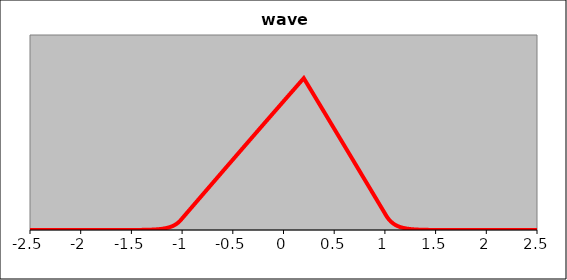
| Category | Series 2 |
|---|---|
| -2.50000000000002 | 0 |
| -2.48000000000002 | 0 |
| -2.46000000000002 | 0 |
| -2.44000000000002 | 0 |
| -2.42000000000002 | 0 |
| -2.40000000000002 | 0 |
| -2.38000000000002 | 0 |
| -2.36000000000002 | 0 |
| -2.34000000000002 | 0 |
| -2.32000000000002 | 0 |
| -2.30000000000002 | 0 |
| -2.28000000000002 | 0 |
| -2.2600000000000198 | 0 |
| -2.2400000000000198 | 0 |
| -2.2200000000000197 | 0 |
| -2.2000000000000197 | 0 |
| -2.1800000000000197 | 0 |
| -2.1600000000000197 | 0 |
| -2.1400000000000197 | 0 |
| -2.1200000000000196 | 0 |
| -2.1000000000000196 | 0 |
| -2.0800000000000196 | 0 |
| -2.0600000000000196 | 0 |
| -2.0400000000000196 | 0 |
| -2.0200000000000196 | 0 |
| -2.0000000000000195 | 0 |
| -1.9800000000000195 | 0 |
| -1.9600000000000195 | 0 |
| -1.9400000000000195 | 0 |
| -1.9200000000000195 | 0 |
| -1.9000000000000195 | 0 |
| -1.8800000000000194 | 0 |
| -1.8600000000000194 | 0 |
| -1.8400000000000194 | 0 |
| -1.8200000000000194 | 0 |
| -1.8000000000000194 | 0 |
| -1.7800000000000193 | 0 |
| -1.7600000000000193 | 0 |
| -1.7400000000000193 | 0 |
| -1.7200000000000193 | 0 |
| -1.7000000000000193 | 0 |
| -1.6800000000000193 | 0 |
| -1.6600000000000192 | 0 |
| -1.6400000000000192 | 0 |
| -1.6200000000000192 | 0 |
| -1.6000000000000192 | 0 |
| -1.5800000000000192 | 0 |
| -1.5600000000000191 | 0 |
| -1.5400000000000191 | 0 |
| -1.5200000000000191 | 0 |
| -1.500000000000019 | 0 |
| -1.480000000000019 | 0 |
| -1.460000000000019 | 0 |
| -1.440000000000019 | 0 |
| -1.420000000000019 | 0 |
| -1.400000000000019 | 0 |
| -1.380000000000019 | 0 |
| -1.360000000000019 | 0 |
| -1.340000000000019 | 0 |
| -1.320000000000019 | 0 |
| -1.300000000000019 | 0 |
| -1.280000000000019 | 0 |
| -1.2600000000000189 | 0 |
| -1.2400000000000189 | 0 |
| -1.2200000000000188 | 0 |
| -1.2000000000000188 | 0 |
| -1.1800000000000188 | 0 |
| -1.1600000000000188 | 0 |
| -1.1400000000000188 | 0 |
| -1.1200000000000188 | 0 |
| -1.1000000000000187 | 0 |
| -1.0800000000000187 | 0 |
| -1.0600000000000187 | 0 |
| -1.0400000000000187 | 0 |
| -1.0200000000000187 | 0 |
| -1.0000000000000187 | 0 |
| -0.9800000000000186 | 0 |
| -0.9600000000000186 | 0 |
| -0.9400000000000186 | 0 |
| -0.9200000000000186 | 0 |
| -0.9000000000000186 | 0 |
| -0.8800000000000185 | 0 |
| -0.8600000000000185 | 0 |
| -0.8400000000000185 | 0 |
| -0.8200000000000185 | 0 |
| -0.8000000000000185 | 0 |
| -0.7800000000000185 | 0 |
| -0.7600000000000184 | 0 |
| -0.7400000000000184 | 0 |
| -0.7200000000000184 | 0 |
| -0.7000000000000184 | 0 |
| -0.6800000000000184 | 0 |
| -0.6600000000000183 | 0 |
| -0.6400000000000183 | 0 |
| -0.6200000000000183 | 0 |
| -0.6000000000000183 | 0 |
| -0.5800000000000183 | 0 |
| -0.5600000000000183 | 0 |
| -0.5400000000000182 | 0 |
| -0.5200000000000182 | 0 |
| -0.5000000000000182 | 0 |
| -0.4800000000000182 | 0 |
| -0.46000000000001817 | 0 |
| -0.44000000000001815 | 0 |
| -0.42000000000001814 | 0 |
| -0.4000000000000181 | 0 |
| -0.3800000000000181 | 0 |
| -0.3600000000000181 | 0 |
| -0.34000000000001807 | 0 |
| -0.32000000000001805 | 0 |
| -0.30000000000001803 | 0 |
| -0.280000000000018 | 0 |
| -0.260000000000018 | 0 |
| -0.240000000000018 | 0 |
| -0.22000000000001801 | 0 |
| -0.20000000000001802 | 0 |
| -0.18000000000001803 | 0 |
| -0.16000000000001804 | 0 |
| -0.14000000000001805 | 0 |
| -0.12000000000001805 | 0 |
| -0.10000000000001805 | 0 |
| -0.08000000000001804 | 0 |
| -0.06000000000001804 | 0 |
| -0.040000000000018035 | 0 |
| -0.020000000000018035 | 0 |
| -1.8034185256254887e-14 | 0 |
| 0.019999999999981966 | 0 |
| 0.03999999999998197 | 0 |
| 0.05999999999998197 | 0 |
| 0.07999999999998197 | 0 |
| 0.09999999999998198 | 0 |
| 0.11999999999998198 | 0 |
| 0.13999999999998197 | 0 |
| 0.15999999999998196 | 0 |
| 0.17999999999998195 | 0 |
| 0.19999999999998194 | 0 |
| 0.21999999999998193 | 0 |
| 0.23999999999998192 | 0 |
| 0.2599999999999819 | 0 |
| 0.27999999999998193 | 0 |
| 0.29999999999998195 | 0 |
| 0.31999999999998197 | 0 |
| 0.339999999999982 | 0 |
| 0.359999999999982 | 0 |
| 0.379999999999982 | 0 |
| 0.39999999999998204 | 0 |
| 0.41999999999998205 | 0 |
| 0.43999999999998207 | 0 |
| 0.4599999999999821 | 0 |
| 0.4799999999999821 | 0 |
| 0.4999999999999821 | 0 |
| 0.5199999999999821 | 0 |
| 0.5399999999999822 | 0 |
| 0.5599999999999822 | 0 |
| 0.5799999999999822 | 0 |
| 0.5999999999999822 | 0 |
| 0.6199999999999822 | 0 |
| 0.6399999999999822 | 0 |
| 0.6599999999999823 | 0 |
| 0.6799999999999823 | 0 |
| 0.6999999999999823 | 0 |
| 0.7199999999999823 | 0 |
| 0.7399999999999823 | 0 |
| 0.7599999999999824 | 0 |
| 0.7799999999999824 | 0 |
| 0.7999999999999824 | 0 |
| 0.8199999999999824 | 0 |
| 0.8399999999999824 | 0 |
| 0.8599999999999824 | 0 |
| 0.8799999999999825 | 0 |
| 0.8999999999999825 | 0 |
| 0.9199999999999825 | 0 |
| 0.9399999999999825 | 0 |
| 0.9599999999999825 | 0 |
| 0.9799999999999826 | 0 |
| 0.9999999999999826 | 0 |
| 1.0199999999999825 | 0 |
| 1.0399999999999825 | 0 |
| 1.0599999999999825 | 0 |
| 1.0799999999999825 | 0 |
| 1.0999999999999825 | 0 |
| 1.1199999999999826 | 0 |
| 1.1399999999999826 | 0 |
| 1.1599999999999826 | 0 |
| 1.1799999999999826 | 0 |
| 1.1999999999999826 | 0 |
| 1.2199999999999827 | 0 |
| 1.2399999999999827 | 0 |
| 1.2599999999999827 | 0 |
| 1.2799999999999827 | 0 |
| 1.2999999999999827 | 0 |
| 1.3199999999999827 | 0 |
| 1.3399999999999828 | 0 |
| 1.3599999999999828 | 0 |
| 1.3799999999999828 | 0 |
| 1.3999999999999828 | 0 |
| 1.4199999999999828 | 0 |
| 1.4399999999999828 | 0 |
| 1.4599999999999829 | 0 |
| 1.4799999999999829 | 0 |
| 1.499999999999983 | 0 |
| 1.519999999999983 | 0 |
| 1.539999999999983 | 0 |
| 1.559999999999983 | 0 |
| 1.579999999999983 | 0 |
| 1.599999999999983 | 0 |
| 1.619999999999983 | 0 |
| 1.639999999999983 | 0 |
| 1.659999999999983 | 0 |
| 1.679999999999983 | 0 |
| 1.699999999999983 | 0 |
| 1.719999999999983 | 0 |
| 1.7399999999999831 | 0 |
| 1.7599999999999831 | 0 |
| 1.7799999999999832 | 0 |
| 1.7999999999999832 | 0 |
| 1.8199999999999832 | 0 |
| 1.8399999999999832 | 0 |
| 1.8599999999999832 | 0 |
| 1.8799999999999832 | 0 |
| 1.8999999999999833 | 0 |
| 1.9199999999999833 | 0 |
| 1.9399999999999833 | 0 |
| 1.9599999999999833 | 0 |
| 1.9799999999999833 | 0 |
| 1.9999999999999833 | 0 |
| 2.019999999999983 | 0 |
| 2.039999999999983 | 0 |
| 2.059999999999983 | 0 |
| 2.079999999999983 | 0 |
| 2.099999999999983 | 0 |
| 2.1199999999999832 | 0 |
| 2.1399999999999832 | 0 |
| 2.1599999999999833 | 0 |
| 2.1799999999999833 | 0 |
| 2.1999999999999833 | 0 |
| 2.2199999999999833 | 0 |
| 2.2399999999999833 | 0 |
| 2.2599999999999834 | 0 |
| 2.2799999999999834 | 0 |
| 2.2999999999999834 | 0 |
| 2.3199999999999834 | 0 |
| 2.3399999999999834 | 0 |
| 2.3599999999999834 | 0 |
| 2.3799999999999835 | 0 |
| 2.3999999999999835 | 0 |
| 2.4199999999999835 | 0 |
| 2.4399999999999835 | 0 |
| 2.4599999999999835 | 0 |
| 2.4799999999999836 | 0 |
| 2.4999999999999836 | 0 |